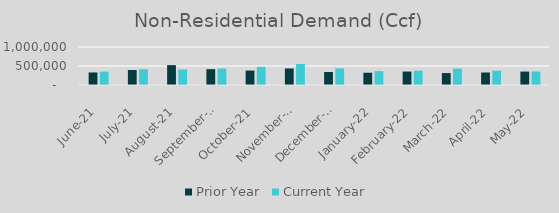
| Category | Prior Year | Current Year |
|---|---|---|
| 2021-06-01 | 330441.187 | 353141.442 |
| 2021-07-01 | 394304.316 | 414577.112 |
| 2021-08-01 | 522963.473 | 407774.995 |
| 2021-09-01 | 416886.629 | 434192.442 |
| 2021-10-01 | 379515 | 477878.526 |
| 2021-11-01 | 434815 | 552599.698 |
| 2021-12-01 | 342584.594 | 436956.784 |
| 2022-01-01 | 322657.16 | 364164.019 |
| 2022-02-01 | 354041 | 377149.369 |
| 2022-03-01 | 313343 | 432270.798 |
| 2022-04-01 | 329084.722 | 376255.784 |
| 2022-05-01 | 353085 | 354792 |